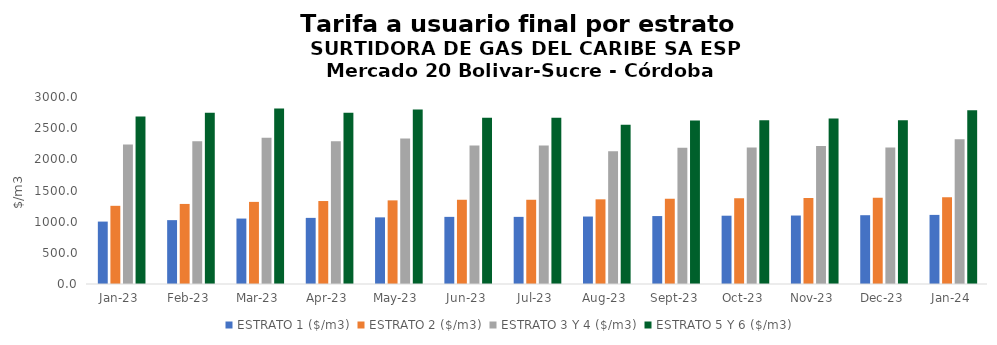
| Category | ESTRATO 1 ($/m3) | ESTRATO 2 ($/m3) | ESTRATO 3 Y 4 ($/m3) | ESTRATO 5 Y 6 ($/m3) |
|---|---|---|---|---|
| 2023-01-01 | 1001.38 | 1254.3 | 2238.4 | 2686.08 |
| 2023-02-01 | 1024.53 | 1284.4 | 2288.91 | 2746.692 |
| 2023-03-01 | 1049.77 | 1317.27 | 2345.6 | 2814.72 |
| 2023-04-01 | 1060.8 | 1331.1 | 2289.32 | 2747.184 |
| 2023-05-01 | 1069.09 | 1341.51 | 2332.27 | 2798.724 |
| 2023-06-01 | 1076.98 | 1351.41 | 2221.89 | 2666.268 |
| 2023-07-01 | 1076.98 | 1351.41 | 2221.89 | 2666.268 |
| 2023-08-01 | 1082.37 | 1358.18 | 2129.89 | 2555.868 |
| 2023-09-01 | 1089.94 | 1367.67 | 2187.17 | 2624.604 |
| 2023-10-01 | 1095.74 | 1374.95 | 2190.44 | 2628.528 |
| 2023-11-01 | 1098.48 | 1378.38 | 2212.27 | 2654.724 |
| 2023-12-01 | 1103.63 | 1384.85 | 2189.08 | 2626.896 |
| 2024-01-01 | 1108.7 | 1391.21 | 2321.9 | 2786.28 |